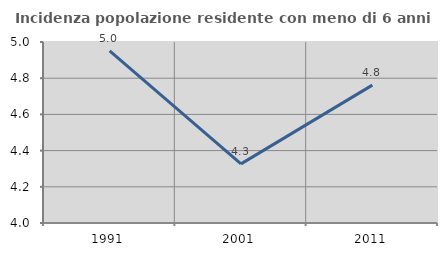
| Category | Incidenza popolazione residente con meno di 6 anni |
|---|---|
| 1991.0 | 4.951 |
| 2001.0 | 4.327 |
| 2011.0 | 4.762 |